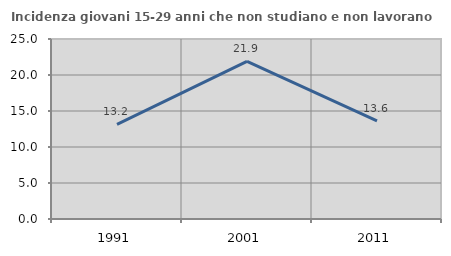
| Category | Incidenza giovani 15-29 anni che non studiano e non lavorano  |
|---|---|
| 1991.0 | 13.152 |
| 2001.0 | 21.893 |
| 2011.0 | 13.636 |